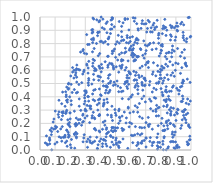
| Category | Series 0 |
|---|---|
| 0.2161539356165708 | 0.586 |
| 0.41989976840279575 | 0.482 |
| 0.9352542422735868 | 0.364 |
| 0.20114116399505655 | 0.039 |
| 100000.0 | 100000 |
| 0.8795964592983412 | 0.64 |
| 0.7748921591389206 | 0.094 |
| 0.61183253903875 | 0.728 |
| 0.23747542398676857 | 0.2 |
| 0.33232374744552895 | 0.097 |
| 0.9572385159710117 | 0.241 |
| 0.23008891402111764 | 0.014 |
| 0.7977676993184044 | 0.021 |
| 100000.0 | 100000 |
| 0.7029643959720894 | 0.747 |
| 0.8457570522916442 | 0.16 |
| 0.7361715812891809 | 0.919 |
| 0.3556559686619015 | 0.984 |
| 0.3066459170334216 | 0.294 |
| 100000.0 | 100000 |
| 0.6024444287754388 | 0.397 |
| 0.689767738971846 | 0.691 |
| 100000.0 | 100000 |
| 0.34143358584577 | 0.832 |
| 100000.0 | 100000 |
| 0.8909479142647417 | 0.263 |
| 100000.0 | 100000 |
| 0.47502444518757647 | 0.943 |
| 100000.0 | 100000 |
| 0.7279271009671584 | 0.515 |
| 0.5890369219224744 | 0.903 |
| 0.3450081896131896 | 0.879 |
| 0.2880844816290302 | 0.214 |
| 0.46309427932886416 | 0.449 |
| 0.9234885255635588 | 0.446 |
| 0.47305454525723445 | 0.247 |
| 100000.0 | 100000 |
| 0.3505128758518026 | 0.653 |
| 0.11003345545765641 | 0.172 |
| 0.4163282621625086 | 0.516 |
| 0.7704589240470142 | 0.256 |
| 0.6444966638122671 | 0.803 |
| 0.35416905204247706 | 0.828 |
| 0.7169626679551163 | 0.665 |
| 0.4362653041262585 | 0.045 |
| 100000.0 | 100000 |
| 0.42452631995949996 | 0.354 |
| 0.46271314737771807 | 0.567 |
| 0.38486134550629203 | 0.039 |
| 0.2276032860003152 | 0.292 |
| 0.8174627857066217 | 0.933 |
| 0.4864012044959657 | 0.619 |
| 0.43257249432898137 | 0.815 |
| 100000.0 | 100000 |
| 0.348404229247705 | 0.421 |
| 0.3627855262940509 | 0.235 |
| 100000.0 | 100000 |
| 0.3103982246565159 | 0.063 |
| 0.35065532570353375 | 0.992 |
| 0.18958295649528623 | 0.501 |
| 0.5605766558687318 | 0.73 |
| 0.10133968948468597 | 0.293 |
| 0.8358072865204941 | 0.476 |
| 0.5955719380326497 | 0.764 |
| 100000.0 | 100000 |
| 0.7722635357408648 | 0.925 |
| 0.8876915098608822 | 0.016 |
| 0.8430997614928754 | 0.338 |
| 0.8427255991765477 | 0.279 |
| 0.35171628626008145 | 0.681 |
| 0.81366804797898 | 0.408 |
| 0.35221129753561753 | 0.378 |
| 0.8137654567318902 | 0.066 |
| 100000.0 | 100000 |
| 0.4414782513297406 | 0.166 |
| 0.894685336148168 | 0.01 |
| 0.46665392885090373 | 0.876 |
| 100000.0 | 100000 |
| 0.6484714881347159 | 0.056 |
| 0.6692057437729021 | 0.914 |
| 0.3040026629180361 | 0.445 |
| 0.8268137096556616 | 0.922 |
| 0.5496234064686124 | 0.083 |
| 100000.0 | 100000 |
| 0.6063901558262088 | 0.751 |
| 0.7484689300069599 | 0.938 |
| 100000.0 | 100000 |
| 0.4435139204763989 | 0.383 |
| 100000.0 | 100000 |
| 0.24072936537829048 | 0.43 |
| 0.3870490325203445 | 0.377 |
| 0.8779951112925786 | 0.135 |
| 0.8368489890606061 | 0.38 |
| 0.4783579836724976 | 0.983 |
| 0.8437905290009425 | 0.184 |
| 0.18649975217800974 | 0.134 |
| 0.994532172213015 | 0.849 |
| 100000.0 | 100000 |
| 0.35957673419079683 | 0.243 |
| 0.5144705458466957 | 0.676 |
| 0.6780416202440906 | 0.972 |
| 0.7018595485948129 | 0.949 |
| 0.8172321611773572 | 0.521 |
| 0.7031949171853407 | 0.089 |
| 0.3182024782410191 | 0.578 |
| 0.4474183520769388 | 0.357 |
| 0.7808330578419791 | 0.057 |
| 0.26590883804134713 | 0.23 |
| 0.8140938097799996 | 0.043 |
| 0.8605464876303114 | 0.664 |
| 0.6498580296543925 | 0.479 |
| 100000.0 | 100000 |
| 0.1766870286308334 | 0.298 |
| 0.5380603899644512 | 0.614 |
| 0.13731205458175855 | 0.159 |
| 0.3503996814501682 | 0.059 |
| 0.5010368804573674 | 0.795 |
| 0.6932517274135809 | 0.534 |
| 0.9130346430179311 | 0.93 |
| 0.8033948839825745 | 0.538 |
| 0.4053760239787898 | 0.409 |
| 0.5008801040690651 | 0.697 |
| 100000.0 | 100000 |
| 0.08711778041327911 | 0.21 |
| 0.6156306264523934 | 0.699 |
| 100000.0 | 100000 |
| 0.5654656374248346 | 0.765 |
| 0.5868868811805875 | 0.804 |
| 0.7539279228868306 | 0.058 |
| 0.8774852047986018 | 0.472 |
| 0.4674477414999131 | 0.109 |
| 0.7780735391836444 | 0.006 |
| 0.6271073925445417 | 0.672 |
| 0.8250647143278582 | 0.542 |
| 100000.0 | 100000 |
| 100000.0 | 100000 |
| 0.8047507636045643 | 0.748 |
| 0.4874070258714641 | 0.039 |
| 0.29276145703731415 | 0.115 |
| 0.6993385012486587 | 0.641 |
| 0.7022049974101413 | 0.206 |
| 100000.0 | 100000 |
| 0.7815393335905971 | 0.316 |
| 100000.0 | 100000 |
| 0.5954620568127152 | 0.279 |
| 100000.0 | 100000 |
| 0.6248249345355702 | 0.968 |
| 100000.0 | 100000 |
| 0.48364797840621054 | 0.137 |
| 0.6973912460050656 | 0.789 |
| 0.4767062776365705 | 0.059 |
| 0.39414652992529253 | 0.26 |
| 0.8784271123001899 | 0.58 |
| 0.6214757202946098 | 0.669 |
| 100000.0 | 100000 |
| 100000.0 | 100000 |
| 0.413635456539839 | 0.026 |
| 0.7590100754607 | 0.905 |
| 0.5415464110174156 | 0.851 |
| 0.8400278599668184 | 0.901 |
| 0.6765204932556063 | 0.63 |
| 0.44535550541910607 | 0.476 |
| 0.28610729086547404 | 0.756 |
| 0.25987894420101154 | 0.384 |
| 0.5783360486779697 | 0.519 |
| 0.2271220263469843 | 0.121 |
| 0.9112236034397349 | 0.763 |
| 0.6492858052713943 | 0.911 |
| 0.12557262978547135 | 0.374 |
| 0.4835549519946887 | 0.093 |
| 0.33305550577464627 | 0.314 |
| 0.9571649707675781 | 0.691 |
| 0.4325619957917777 | 0.479 |
| 0.675145354288876 | 0.508 |
| 0.299233196999524 | 0.296 |
| 0.5051266582021852 | 0.625 |
| 0.4199936199297607 | 0.806 |
| 0.44696051405441684 | 0.129 |
| 0.5240828358347355 | 0.307 |
| 0.6990808962996781 | 0.522 |
| 100000.0 | 100000 |
| 100000.0 | 100000 |
| 0.5874812400544747 | 0.494 |
| 0.6317933143239283 | 0.176 |
| 0.2956110134236266 | 0.391 |
| 0.2923193159513082 | 0.6 |
| 0.7571890980332072 | 0.394 |
| 0.4166379338688877 | 0.984 |
| 100000.0 | 100000 |
| 0.4477449682096104 | 0.704 |
| 100000.0 | 100000 |
| 0.32232055922351177 | 0.367 |
| 0.9091163710487771 | 0.018 |
| 0.7108506981624562 | 0.783 |
| 0.23703389161985722 | 0.58 |
| 0.6888135037152123 | 0.538 |
| 100000.0 | 100000 |
| 0.12080180044392519 | 0.267 |
| 0.3357422234892846 | 0.33 |
| 0.27018320631858517 | 0.298 |
| 100000.0 | 100000 |
| 0.6404366334616473 | 0.033 |
| 0.2935645880855714 | 0.727 |
| 0.18974963144224288 | 0.464 |
| 0.8641580990747965 | 0.827 |
| 0.5512236396858423 | 0.826 |
| 0.8370405661654527 | 0.727 |
| 0.6156325773028273 | 0.108 |
| 0.5157860296623329 | 0.481 |
| 0.4405582451316289 | 0.121 |
| 0.7199908444301367 | 0.176 |
| 100000.0 | 100000 |
| 100000.0 | 100000 |
| 0.9893917306930223 | 0.076 |
| 0.8703921242918102 | 0.854 |
| 0.14911529833595194 | 0.257 |
| 0.7424640935420491 | 0.755 |
| 0.4041612710457705 | 0.083 |
| 0.5606307026728751 | 0.497 |
| 0.4130326518182461 | 0.616 |
| 0.044936852388212545 | 0.047 |
| 0.8339295491779962 | 0.363 |
| 0.8649326083031706 | 0.271 |
| 0.39690805388752204 | 0.614 |
| 0.3799069616132692 | 0.013 |
| 0.3157836041023616 | 0.793 |
| 100000.0 | 100000 |
| 100000.0 | 100000 |
| 0.6501492892115902 | 0.828 |
| 0.16030550000732224 | 0.097 |
| 0.7850547899392751 | 0.257 |
| 0.6236168348974531 | 0.524 |
| 100000.0 | 100000 |
| 0.8463578136750755 | 0.013 |
| 0.4222346371207769 | 0.348 |
| 0.45915310682362176 | 0.437 |
| 0.7277437696514759 | 0.065 |
| 0.5955658162719669 | 0.846 |
| 0.9671263497926211 | 0.266 |
| 0.519699922907073 | 0.03 |
| 0.6808887312694432 | 0.712 |
| 100000.0 | 100000 |
| 0.724327339117487 | 0.963 |
| 0.7971523251236095 | 0.565 |
| 0.8540554858579066 | 0.735 |
| 0.3212281639520901 | 0.487 |
| 0.3623238701722653 | 0.371 |
| 100000.0 | 100000 |
| 0.9418885664438478 | 0.507 |
| 0.19846484954860344 | 0.176 |
| 0.904050593890364 | 0.029 |
| 0.606769126997257 | 0.713 |
| 0.5287691661675266 | 0.632 |
| 100000.0 | 100000 |
| 0.17008842860875562 | 0.438 |
| 0.9699716753855563 | 0.814 |
| 0.13904248039666922 | 0.093 |
| 100000.0 | 100000 |
| 0.8976393136235393 | 0.061 |
| 0.6677989491663604 | 0.755 |
| 0.07806497772430676 | 0.001 |
| 100000.0 | 100000 |
| 0.8218451781444016 | 0.617 |
| 0.3227544406798609 | 0.525 |
| 0.9007321652645686 | 0.222 |
| 0.3459469266448305 | 0.258 |
| 0.4053074894052573 | 0.588 |
| 100000.0 | 100000 |
| 0.6013295515187901 | 0.4 |
| 100000.0 | 100000 |
| 100000.0 | 100000 |
| 0.5252592630170598 | 0.06 |
| 0.6612015851181061 | 0.17 |
| 0.6116479478042575 | 0.415 |
| 0.8302002787218757 | 0.441 |
| 0.9471396139826678 | 0.526 |
| 0.30986966253961046 | 0.646 |
| 0.6519075640238242 | 0.703 |
| 0.9514955520571087 | 0.941 |
| 0.9978722101556757 | 0.854 |
| 0.9645457253125571 | 0.654 |
| 0.348880957284859 | 0.63 |
| 0.9044428359692432 | 0.283 |
| 0.884211800169146 | 0.062 |
| 0.9855708750236848 | 0.344 |
| 0.35865154406628397 | 0.763 |
| 0.7679011204779839 | 0.305 |
| 0.8777369880975842 | 0.782 |
| 0.7433915475733103 | 0.887 |
| 0.06378914394543145 | 0.072 |
| 0.45403216484671327 | 0.135 |
| 0.17783484537935457 | 0.148 |
| 0.7724327430335248 | 0.336 |
| 0.8990202852409879 | 0.849 |
| 0.523019792163674 | 0.018 |
| 0.4246470611905723 | 0.076 |
| 0.5449580733607431 | 0.386 |
| 0.38369100442770665 | 0.882 |
| 0.45508617591180645 | 0.561 |
| 100000.0 | 100000 |
| 0.45022848305588414 | 0.637 |
| 0.7895901682202835 | 0.707 |
| 0.9094891405102665 | 0.037 |
| 100000.0 | 100000 |
| 0.5635129035813577 | 0.98 |
| 0.4071778194988114 | 0.817 |
| 0.883572493560269 | 0.314 |
| 100000.0 | 100000 |
| 0.29590412700034774 | 0.412 |
| 0.5109441080328259 | 0.814 |
| 100000.0 | 100000 |
| 0.8323609164249491 | 0.922 |
| 100000.0 | 100000 |
| 0.4935504369765089 | 0.759 |
| 0.46137129005663546 | 0.652 |
| 0.6123712583181691 | 0.852 |
| 0.43054717368240947 | 0.218 |
| 0.1812907303855258 | 0.36 |
| 0.9298582233336461 | 0.474 |
| 0.24402626569893582 | 0.639 |
| 0.8125526818961452 | 0.913 |
| 0.3812572289457742 | 0.86 |
| 0.42117592440608465 | 0.078 |
| 0.8718337546394386 | 0.73 |
| 0.6575793676242783 | 0.545 |
| 0.3193901949244844 | 0.506 |
| 0.17408255747036727 | 0.414 |
| 0.8675427273861873 | 0.319 |
| 0.563382843097646 | 0.988 |
| 100000.0 | 100000 |
| 0.06326542471394003 | 0.09 |
| 0.2535090642840061 | 0.228 |
| 0.5780035241687718 | 0.844 |
| 0.19447284984645252 | 0.206 |
| 0.6622635523361565 | 0.616 |
| 0.9653637561556796 | 0.227 |
| 0.7148115714099713 | 0.656 |
| 0.19100861022531712 | 0.188 |
| 0.43900096495097873 | 0.155 |
| 0.6938031754775056 | 0.54 |
| 0.748574669875447 | 0.293 |
| 0.5496320894907313 | 0.443 |
| 0.3486936007191421 | 0.807 |
| 0.9793223323568793 | 0.039 |
| 0.3232228025016989 | 0.667 |
| 0.2977391018253992 | 0.241 |
| 0.8375248754189472 | 0.216 |
| 100000.0 | 100000 |
| 0.3177397680627416 | 0.083 |
| 0.28962303392210387 | 0.588 |
| 100000.0 | 100000 |
| 0.44549946822202524 | 0.963 |
| 0.45106115881645703 | 0.429 |
| 0.6807857857260671 | 0.45 |
| 0.6338427732365622 | 0.485 |
| 0.8895567920514615 | 0.554 |
| 0.4236680211710556 | 0.376 |
| 0.034999285437185446 | 0.053 |
| 0.3933644899746831 | 0.459 |
| 0.8167983984908876 | 0.002 |
| 0.8989392749071643 | 0.654 |
| 0.07702373903624016 | 0.165 |
| 0.2821061848885069 | 0.209 |
| 0.22621218344685756 | 0.599 |
| 0.911185245064318 | 0.306 |
| 0.24512186773458444 | 0.122 |
| 0.35040115393110094 | 0.887 |
| 100000.0 | 100000 |
| 0.6449987093613583 | 0.32 |
| 0.20638637844330998 | 0.017 |
| 0.196439689819916 | 0.4 |
| 0.5755661192026909 | 0.543 |
| 0.24006997256800922 | 0.1 |
| 0.2423306048670898 | 0.611 |
| 100000.0 | 100000 |
| 0.39579143678330087 | 0.972 |
| 0.7768087571487554 | 0.032 |
| 0.8646386325876582 | 0.866 |
| 100000.0 | 100000 |
| 100000.0 | 100000 |
| 0.19911648494038858 | 0.28 |
| 0.07527996080133037 | 0.115 |
| 100000.0 | 100000 |
| 0.24156917855556015 | 0.091 |
| 0.8082628267117962 | 0.238 |
| 0.5951914799501979 | 0.581 |
| 0.5728054147474118 | 0.807 |
| 0.9682213604385459 | 0.352 |
| 0.8796499198286297 | 0.096 |
| 0.43804508904840456 | 0.951 |
| 0.8399076938220617 | 0.685 |
| 0.499460638724875 | 0.491 |
| 100000.0 | 100000 |
| 100000.0 | 100000 |
| 0.2585228314103668 | 0.201 |
| 0.42260580299232886 | 0.342 |
| 0.833767956408413 | 0.452 |
| 0.4919374073342221 | 0.146 |
| 0.8710056695357674 | 0.919 |
| 0.7288306473159012 | 0.802 |
| 0.34403791162159436 | 0.241 |
| 0.7868918120944124 | 0.877 |
| 0.8189353778838091 | 0.329 |
| 0.1475708515238121 | 0.176 |
| 0.43761506671012684 | 0.099 |
| 0.1530055972801605 | 0.288 |
| 0.6733544592396673 | 0.051 |
| 0.7761248935370187 | 0.975 |
| 0.697367004399133 | 0.724 |
| 0.2132100475703005 | 0.433 |
| 0.5388919880438472 | 0.821 |
| 0.7810206499689517 | 0.121 |
| 0.6539066694877919 | 0.006 |
| 100000.0 | 100000 |
| 0.5890006885744907 | 0.541 |
| 0.2429192267029051 | 0.547 |
| 0.1658287183140087 | 0.097 |
| 0.3609918598700832 | 0.597 |
| 0.501281767402513 | 0.167 |
| 100000.0 | 100000 |
| 100000.0 | 100000 |
| 0.6970889801025905 | 0.488 |
| 0.851452152701772 | 0.404 |
| 0.30342235799463657 | 0.428 |
| 0.2039665821174368 | 0.556 |
| 0.9814744795705573 | 0.042 |
| 0.9720636813065929 | 0.837 |
| 0.8354742875771314 | 0.001 |
| 0.6400468684009598 | 0.839 |
| 0.7876426157718219 | 0.513 |
| 0.47240009723965737 | 0.146 |
| 0.3620352690411436 | 0.066 |
| 0.8370653675229826 | 0.205 |
| 0.4480287499430319 | 0.264 |
| 0.6598224959353272 | 0.25 |
| 0.27525414617461563 | 0.186 |
| 100000.0 | 100000 |
| 0.17977359762434586 | 0.028 |
| 0.07707981595026747 | 0.139 |
| 0.9757272986450334 | 0.533 |
| 0.862327462220161 | 0.373 |
| 0.61692944995512 | 0.994 |
| 0.2273153105117215 | 0.454 |
| 100000.0 | 100000 |
| 0.480909660994258 | 0.992 |
| 0.6327472273925381 | 0.676 |
| 0.81065834960449 | 0.781 |
| 100000.0 | 100000 |
| 0.8512854030177606 | 0.223 |
| 0.5103859568208314 | 0.519 |
| 0.8420100028114222 | 0.565 |
| 0.3607909487217238 | 0.673 |
| 0.48864187170422557 | 0.169 |
| 100000.0 | 100000 |
| 0.7812131252688854 | 0.591 |
| 0.7437220844806409 | 0.436 |
| 100000.0 | 100000 |
| 0.7258303580881399 | 0.382 |
| 0.6747229420324705 | 0.95 |
| 0.8887626904322424 | 0.743 |
| 0.7429663988023365 | 0.034 |
| 0.6978506135492212 | 0.362 |
| 0.5814771238960005 | 0.012 |
| 0.54013287966447 | 0.89 |
| 0.9784595479397352 | 0.044 |
| 0.9939334223915954 | 0.078 |
| 100000.0 | 100000 |
| 100000.0 | 100000 |
| 0.6437634626512232 | 0.698 |
| 100000.0 | 100000 |
| 0.691923110367989 | 0.168 |
| 0.8745115393199352 | 0.064 |
| 0.577102125151582 | 0.86 |
| 0.22462123289700042 | 0.541 |
| 0.9781841875784675 | 0.276 |
| 0.8690507514947815 | 0.442 |
| 100000.0 | 100000 |
| 0.17686728137666163 | 0.15 |
| 0.486924029257065 | 0.743 |
| 0.8956344731553232 | 0.135 |
| 0.31222324413449076 | 0.256 |
| 0.7932466149432835 | 0.538 |
| 0.5061448433016141 | 0.052 |
| 0.1715013471344572 | 0.276 |
| 0.47864157170062016 | 0.725 |
| 0.8224651848237635 | 0.915 |
| 0.8094938840945678 | 0.794 |
| 0.2552427031145833 | 0.605 |
| 0.23674795634049917 | 0.18 |
| 0.14987583072362765 | 0.436 |
| 0.9493240019417231 | 0.86 |
| 0.5404417652534308 | 0.73 |
| 0.3902837494472453 | 0.964 |
| 0.6744733539520829 | 0.167 |
| 0.14366651853310453 | 0.348 |
| 0.8137781138873771 | 0.146 |
| 0.8674623121163298 | 0.562 |
| 0.2853265530548539 | 0.061 |
| 100000.0 | 100000 |
| 0.5699042390064201 | 0.203 |
| 0.4342275327441245 | 0.07 |
| 0.7846787043015442 | 0.84 |
| 0.37048847851419187 | 0.606 |
| 100000.0 | 100000 |
| 0.17724382046797882 | 0.067 |
| 100000.0 | 100000 |
| 100000.0 | 100000 |
| 0.37048128753796294 | 0.598 |
| 100000.0 | 100000 |
| 100000.0 | 100000 |
| 0.17322713902621778 | 0.401 |
| 0.7842956498553818 | 0.022 |
| 0.6745437734959007 | 0.555 |
| 0.20637282530927403 | 0.37 |
| 100000.0 | 100000 |
| 0.9077574063620687 | 0.901 |
| 0.6211499532394503 | 0.591 |
| 0.5801086368763595 | 0.462 |
| 0.2998684318961883 | 0.307 |
| 0.360045464145037 | 0.159 |
| 0.5305835134932086 | 0.058 |
| 0.4427709229615924 | 0.029 |
| 100000.0 | 100000 |
| 0.8943803318320779 | 0.825 |
| 0.48550369764228973 | 0.632 |
| 0.6415397051962547 | 0.704 |
| 0.8634380226678976 | 0.937 |
| 0.2850597344482104 | 0.269 |
| 0.06706393202554828 | 0.15 |
| 100000.0 | 100000 |
| 0.2062985918433078 | 0.494 |
| 0.5260596886439858 | 0.246 |
| 100000.0 | 100000 |
| 0.2575786130551333 | 0.493 |
| 0.0642676930549766 | 0.046 |
| 0.4567253393526831 | 0.849 |
| 0.32535986067840617 | 0.794 |
| 0.5254186737042437 | 0.718 |
| 0.9055212408357552 | 0.464 |
| 100000.0 | 100000 |
| 0.5584746862371954 | 0.285 |
| 0.16977863458769238 | 0.277 |
| 0.7713395809431829 | 0.502 |
| 0.1769108908059137 | 0.473 |
| 0.10182656669573076 | 0.178 |
| 0.5767596677975096 | 0.51 |
| 0.7787901116892648 | 0.635 |
| 0.5979603696720714 | 0.816 |
| 0.3910821798095393 | 0.144 |
| 0.8494432346426387 | 0.53 |
| 0.7306361284172296 | 0.093 |
| 0.6191979492867346 | 0.79 |
| 0.3945375755750612 | 0.066 |
| 100000.0 | 100000 |
| 0.12428248745914727 | 0.247 |
| 0.3092186212786776 | 0.867 |
| 0.7516267850196204 | 0.656 |
| 0.47629482315338667 | 0.329 |
| 0.465045453748236 | 0.504 |
| 100000.0 | 100000 |
| 100000.0 | 100000 |
| 0.5208675532660367 | 0.059 |
| 0.5208290240642418 | 0.201 |
| 0.3740152401435315 | 0.801 |
| 0.3440060276945064 | 0.051 |
| 0.4787283045106263 | 0.166 |
| 0.40023473286109235 | 0.548 |
| 0.6352443794900545 | 0.827 |
| 0.6041661103175165 | 0.78 |
| 0.3544680758150949 | 0.569 |
| 0.7659360032133233 | 0.389 |
| 0.8121342450651896 | 0.502 |
| 0.8753654840421887 | 0.928 |
| 100000.0 | 100000 |
| 0.9775486374504836 | 0.383 |
| 100000.0 | 100000 |
| 0.5048463042497411 | 0.089 |
| 0.9706698640332 | 0.631 |
| 0.6494361702296393 | 0.423 |
| 0.14173614512337018 | 0.229 |
| 0.5436658501754066 | 0.255 |
| 0.9672632541924258 | 0.206 |
| 0.32228948483420694 | 0.538 |
| 0.3279485971432018 | 0.33 |
| 0.9915768198003447 | 0.169 |
| 0.44491415152689195 | 0.304 |
| 0.7523181074895072 | 0.806 |
| 0.24030365249553398 | 0.24 |
| 100000.0 | 100000 |
| 0.8755745370086633 | 0.119 |
| 0.3119035704212514 | 0.335 |
| 100000.0 | 100000 |
| 0.06384537776620347 | 0.079 |
| 0.7920324779929047 | 0.056 |
| 0.5881529986748086 | 0.589 |
| 0.3689292280337314 | 0.15 |
| 0.4751111523955045 | 0.645 |
| 0.4534928119424403 | 0.5 |
| 0.31096959820044856 | 0.637 |
| 0.8618377477771036 | 0.198 |
| 0.2449721160727094 | 0.19 |
| 0.20002029939595534 | 0.234 |
| 0.7453556741974118 | 0.054 |
| 0.23686079925917136 | 0.133 |
| 0.9426134903766706 | 0.29 |
| 0.9612576542922874 | 0.648 |
| 100000.0 | 100000 |
| 0.8572897849552676 | 0.303 |
| 0.41847585594483105 | 0.209 |
| 0.43149613548540233 | 0.664 |
| 0.5550813228788026 | 0.827 |
| 0.47617879172836397 | 0.91 |
| 100000.0 | 100000 |
| 100000.0 | 100000 |
| 0.5494792863398003 | 0.675 |
| 0.4493530373607929 | 0.622 |
| 0.7022913409557965 | 0.023 |
| 0.09870495708971072 | 0.045 |
| 0.18395476294930913 | 0.227 |
| 0.7541856366942632 | 0.953 |
| 0.42630044822001123 | 0.909 |
| 0.24338535673770334 | 0.511 |
| 0.6054994101322387 | 0.11 |
| 0.5405647223515567 | 0.93 |
| 0.5404627147244522 | 0.624 |
| 0.6470628255993647 | 0.454 |
| 0.6778573860680143 | 0.487 |
| 0.18798761822608345 | 0.096 |
| 0.754232207533115 | 0.465 |
| 100000.0 | 100000 |
| 0.28436041415873725 | 0.746 |
| 100000.0 | 100000 |
| 0.8395062570280519 | 0.435 |
| 0.769753787715513 | 0.454 |
| 0.41902146290682696 | 0.33 |
| 0.37934100023457606 | 0.34 |
| 0.6143381687147321 | 0.728 |
| 0.15417840625646173 | 0.095 |
| 0.4856563996565939 | 0.486 |
| 0.8200378529905683 | 0.182 |
| 0.8838326270129051 | 0.189 |
| 0.40730209427083164 | 0.644 |
| 0.9555500771669891 | 0.826 |
| 0.5501810593599021 | 0.956 |
| 0.6413540676893247 | 0.832 |
| 0.38389751361939983 | 0.555 |
| 0.38092121949109725 | 0.009 |
| 0.37557809622871174 | 0.095 |
| 0.6299125946671931 | 0.992 |
| 0.584453463145128 | 0.315 |
| 0.7850162377797247 | 0.864 |
| 0.41390378905194225 | 0.156 |
| 0.6277742768449927 | 0.113 |
| 0.5060360703393701 | 0.043 |
| 0.9477473803957017 | 0.885 |
| 100000.0 | 100000 |
| 0.3761158383573717 | 0.979 |
| 0.786034440475626 | 0.803 |
| 0.7446610836746281 | 0.57 |
| 0.9317996234876603 | 0.163 |
| 0.653056576846466 | 0.562 |
| 0.5213457471350493 | 0.585 |
| 0.8102985055901597 | 0.875 |
| 0.962580428773327 | 0.303 |
| 0.47895552267023733 | 0.744 |
| 100000.0 | 100000 |
| 0.18536801773086187 | 0.195 |
| 100000.0 | 100000 |
| 0.5656340102474062 | 0.512 |
| 0.6683894732509744 | 0.053 |
| 0.8962406414778786 | 0.599 |
| 0.5395333043558724 | 0.439 |
| 0.3210056094431062 | 0.401 |
| 0.6904896530550215 | 0.072 |
| 0.7327140444476824 | 0.311 |
| 0.8679039636646535 | 0.289 |
| 0.8663912595649401 | 0.262 |
| 0.23227239621358564 | 0.193 |
| 0.9819883714000636 | 0.996 |
| 0.49595827082312305 | 0.304 |
| 0.36150889193242164 | 0.615 |
| 100000.0 | 100000 |
| 100000.0 | 100000 |
| 100000.0 | 100000 |
| 0.71712301997804 | 0.189 |
| 0.6770813280443939 | 0.067 |
| 0.47026614577441095 | 0.977 |
| 0.14518659332295514 | 0.283 |
| 0.39886939998237525 | 0.815 |
| 0.3426737836498501 | 0.903 |
| 0.8393926682622623 | 0.326 |
| 100000.0 | 100000 |
| 0.767226272709356 | 0.558 |
| 0.5406946723254582 | 0.68 |
| 0.7267207746018668 | 0.193 |
| 0.5248404715967404 | 0.966 |
| 0.5254253648717758 | 0.804 |
| 0.6469704725751497 | 0.284 |
| 0.828206792048241 | 0.15 |
| 0.2633123638759819 | 0.602 |
| 100000.0 | 100000 |
| 0.09253913125731139 | 0.233 |
| 0.9957872544240333 | 0.368 |
| 0.43967576140284614 | 0.483 |
| 0.5718868503758952 | 0.511 |
| 0.27662484688278055 | 0.506 |
| 0.8523209171546353 | 0.383 |
| 0.2085052787880387 | 0.079 |
| 0.6775864311180786 | 0.239 |
| 0.521907236985914 | 0.295 |
| 0.8458003494036043 | 0.629 |
| 0.7089834148434923 | 0.658 |
| 0.23889617456403955 | 0.599 |
| 100000.0 | 100000 |
| 0.6441662164489186 | 0.501 |
| 0.9829000375860748 | 0.048 |
| 0.6507136945936093 | 0.901 |
| 0.4801885420634424 | 0.222 |
| 0.34772039689222867 | 0.738 |
| 0.8221476592951615 | 0.375 |
| 0.21581009577709265 | 0.619 |
| 0.9137094429575304 | 0.45 |
| 0.42148085378345956 | 0.076 |
| 0.594262123157194 | 0.206 |
| 0.9943681776596239 | 0.508 |
| 0.9097196941103439 | 0.273 |
| 0.36288148556162025 | 0.161 |
| 0.8832842049872964 | 0.482 |
| 0.8642018915272062 | 0.201 |
| 0.45082487008685235 | 0.794 |
| 0.8515201139085727 | 0.733 |
| 0.6262538713567845 | 0.715 |
| 0.530911045711461 | 0.219 |
| 0.7243800649767799 | 0.488 |
| 100000.0 | 100000 |
| 0.33023132292944446 | 0.07 |
| 0.4522594290932499 | 0.54 |
| 0.11736275632684612 | 0.139 |
| 100000.0 | 100000 |
| 0.66324165203839 | 0.113 |
| 0.4330131639408774 | 0.429 |
| 0.16583473738501586 | 0.111 |
| 0.40093847325777776 | 0.416 |
| 0.5930319077555344 | 0.576 |
| 0.8017642729020216 | 0.462 |
| 0.6406855859204101 | 0.95 |
| 0.6132955144005047 | 0.751 |
| 0.7677033299748451 | 0.29 |
| 0.8903682096477339 | 0.918 |
| 0.6892098028580068 | 0.947 |
| 100000.0 | 100000 |
| 0.9571661051894861 | 0.303 |
| 0.6873750128893156 | 0.82 |
| 0.3167516150986408 | 0.402 |
| 0.9301068823278266 | 0.705 |
| 0.7955970570354943 | 0.586 |
| 0.44410751648324087 | 0.472 |
| 0.9475311412973252 | 0.384 |
| 0.45190602981004957 | 0.836 |
| 0.939388919971099 | 0.96 |
| 0.6398827063103938 | 0.525 |
| 100000.0 | 100000 |
| 0.5904347306086828 | 0.174 |
| 0.5013508962225716 | 0.144 |
| 100000.0 | 100000 |
| 0.7608114463451493 | 0.919 |
| 0.2832980159011502 | 0.571 |
| 0.46654438742418625 | 0.908 |
| 0.7015792115556282 | 0.091 |
| 0.939334685177777 | 0.619 |
| 0.29568068364380495 | 0.444 |
| 0.5542714831101204 | 0.153 |
| 0.6876868421320499 | 0.405 |
| 100000.0 | 100000 |
| 0.7886284540753999 | 0.321 |
| 0.51378658609896 | 0.167 |
| 0.46621649693470146 | 0.02 |
| 0.8721456556508352 | 0.7 |
| 0.5214508960322984 | 0.438 |
| 0.8352710762287054 | 0.372 |
| 100000.0 | 100000 |
| 0.5835271636016826 | 0.67 |
| 0.6242263066393349 | 0.716 |
| 0.7169223936512344 | 0.245 |
| 0.6765011788292707 | 0.495 |
| 0.1662143849835629 | 0.329 |
| 100000.0 | 100000 |
| 100000.0 | 100000 |
| 0.31899322885486914 | 0.616 |
| 0.38601353275556227 | 0.709 |
| 0.050150111840483125 | 0.038 |
| 0.15186507535001392 | 0.278 |
| 0.3562974954783308 | 0.528 |
| 0.9566248676380843 | 0.755 |
| 0.4918005164129222 | 0.926 |
| 100000.0 | 100000 |
| 0.8227844225848643 | 0.1 |
| 0.18801442343724406 | 0.496 |
| 0.4991858141285399 | 0.278 |
| 0.6070802643806749 | 0.198 |
| 0.9110566518488161 | 0.895 |
| 0.39608011547452404 | 0.384 |
| 100000.0 | 100000 |
| 0.5750374005196371 | 0.477 |
| 0.9403491777848496 | 0.734 |
| 0.2927022434477736 | 0.346 |
| 0.7180162872984243 | 0.62 |
| 0.9508060690049497 | 0.26 |
| 0.9922451506051916 | 0.104 |
| 0.7980947372060285 | 0.727 |
| 0.2596532093465902 | 0.329 |
| 100000.0 | 100000 |
| 100000.0 | 100000 |
| 0.3088550924461442 | 0.723 |
| 0.9067026419432186 | 0.955 |
| 0.4433317871775847 | 0.882 |
| 0.18840111685339034 | 0.117 |
| 0.5472713567029844 | 0.146 |
| 100000.0 | 100000 |
| 0.9198108677691555 | 0.421 |
| 0.8068649188047584 | 0.6 |
| 0.5630294748888055 | 0.601 |
| 100000.0 | 100000 |
| 0.39534368283653654 | 0.725 |
| 0.9143046460284752 | 0.302 |
| 100000.0 | 100000 |
| 0.7827496277097576 | 0.183 |
| 0.19862747244861667 | 0.278 |
| 0.9209661091850612 | 0.021 |
| 0.8301083166260349 | 0.703 |
| 0.4767144597438644 | 0.994 |
| 0.8088428796807996 | 0.433 |
| 0.19337775211317276 | 0.106 |
| 0.2073843966122737 | 0.341 |
| 0.8647385877252662 | 0.062 |
| 0.5776485974528265 | 0.561 |
| 0.31473348108000365 | 0.02 |
| 0.41257222544688466 | 0.919 |
| 0.3371857118536291 | 0.309 |
| 100000.0 | 100000 |
| 100000.0 | 100000 |
| 100000.0 | 100000 |
| 0.769842381830744 | 0.76 |
| 0.38283795726227265 | 0.885 |
| 0.6187601710138138 | 0.287 |
| 0.4679130266141003 | 0.517 |
| 0.8501966211298104 | 0.024 |
| 0.8064186274987799 | 0.63 |
| 0.5035009945265774 | 0.26 |
| 0.39068363666351924 | 0.631 |
| 0.3554839416779244 | 0.449 |
| 0.7980482394780269 | 0.607 |
| 0.1024729001854211 | 0.162 |
| 0.9303642568155629 | 0.576 |
| 0.9147394670996717 | 0.648 |
| 0.48760598430034674 | 0.609 |
| 0.45188543210170506 | 0.705 |
| 0.38967585077127187 | 0.554 |
| 0.9670140278159862 | 0.637 |
| 0.5987210477877777 | 0.571 |
| 100000.0 | 100000 |
| 100000.0 | 100000 |
| 0.9843036800196007 | 0.189 |
| 0.47683239724733495 | 0.17 |
| 0.8225733737141598 | 0.146 |
| 0.39310702314435186 | 0.626 |
| 0.17488590003070958 | 0.287 |
| 0.650234394248985 | 0.045 |
| 0.4686701349440049 | 0.102 |
| 100000.0 | 100000 |
| 0.5282558743833922 | 0.243 |
| 0.5845334935202232 | 0.322 |
| 100000.0 | 100000 |
| 0.5807083325820445 | 0.985 |
| 0.9456368683079951 | 0.501 |
| 0.9838869820204684 | 0.18 |
| 0.38318302137583893 | 0.3 |
| 0.9420804833332697 | 0.227 |
| 0.042702606271944554 | 0.106 |
| 0.4381753020271788 | 0.449 |
| 100000.0 | 100000 |
| 0.2897802178765282 | 0.09 |
| 0.12674099828046537 | 0.099 |
| 0.706896447937775 | 0.887 |
| 0.9378201988055306 | 0.185 |
| 0.47235922819349063 | 0.261 |
| 0.5911260377409562 | 0.751 |
| 0.8345227102171859 | 0.862 |
| 0.5018279530732392 | 0.074 |
| 0.5722081953973207 | 0.241 |
| 0.3531165302506014 | 0.283 |
| 0.6282801308333547 | 0.528 |
| 0.11265593711147048 | 0.059 |
| 100000.0 | 100000 |
| 0.5332231269027894 | 0.469 |
| 0.36559903955035156 | 0.454 |
| 0.42952793674959033 | 0.187 |
| 0.3957243453275199 | 0.136 |
| 0.3537031607354092 | 0.84 |
| 100000.0 | 100000 |
| 0.5692164304986155 | 0.738 |
| 0.8766259234106685 | 0.753 |
| 0.1755629646218282 | 0.372 |
| 0.4142799744396982 | 0.047 |
| 0.8266085691809608 | 0.982 |
| 0.7319256044233263 | 0.888 |
| 0.24856922366870648 | 0.434 |
| 0.1816022404394092 | 0.377 |
| 100000.0 | 100000 |
| 100000.0 | 100000 |
| 0.38873053190074613 | 0.524 |
| 100000.0 | 100000 |
| 0.5427217139754359 | 0.162 |
| 0.7491005081237627 | 0.587 |
| 100000.0 | 100000 |
| 0.6183307557546172 | 0.763 |
| 0.7117891063727398 | 0.914 |
| 0.8162834440513513 | 0.618 |
| 0.2288531974415059 | 0.116 |
| 0.2836501960692276 | 0.261 |
| 0.7160745975927771 | 0.974 |
| 0.9884309784605608 | 0.997 |
| 100000.0 | 100000 |
| 0.544610350188826 | 0.639 |
| 0.9437529525828321 | 0.406 |
| 100000.0 | 100000 |
| 0.3939369624056994 | 0.267 |
| 0.9507354723463413 | 0.518 |
| 0.8015530155585247 | 0.787 |
| 0.743958309003902 | 0.157 |
| 0.8211420466317834 | 0.091 |
| 0.51852400888631 | 0.862 |
| 0.9423884575026449 | 0.365 |
| 0.2687066704201867 | 0.736 |
| 0.49084667397360404 | 0.51 |
| 0.6465764511724684 | 0.121 |
| 0.6745812878851986 | 0.122 |
| 0.09079528610870513 | 0.157 |
| 0.5708918240952838 | 0.62 |
| 0.3926830201942094 | 0.887 |
| 0.5394397711743586 | 0.669 |
| 100000.0 | 100000 |
| 100000.0 | 100000 |
| 100000.0 | 100000 |
| 0.9481707111277052 | 0.844 |
| 0.6371957707252935 | 0.583 |
| 100000.0 | 100000 |
| 100000.0 | 100000 |
| 100000.0 | 100000 |
| 100000.0 | 100000 |
| 0.47601371202645437 | 0.649 |
| 0.7837883730251486 | 0.501 |
| 0.6916702691373745 | 0.483 |
| 100000.0 | 100000 |
| 0.9744364485794659 | 0.061 |
| 0.6747886484887012 | 0.386 |
| 100000.0 | 100000 |
| 0.2981967272214471 | 0.366 |
| 100000.0 | 100000 |
| 0.18680358544003695 | 0.457 |
| 0.8569234482995839 | 0.441 |
| 0.3288734319575639 | 0.206 |
| 0.39018000100629013 | 0.259 |
| 100000.0 | 100000 |
| 0.8241952952326083 | 0.149 |
| 0.6320382750503398 | 0.561 |
| 0.8037094393323553 | 0.2 |
| 0.9316988587790327 | 0.948 |
| 0.1441422105001806 | 0.066 |
| 0.7354317306072483 | 0.367 |
| 0.3435588809427673 | 0.496 |
| 0.39107989483807193 | 0.259 |
| 0.4050712984175434 | 0.999 |
| 0.12566931425366634 | 0.287 |
| 0.6144967775578613 | 0.055 |
| 0.630507025765446 | 0.332 |
| 100000.0 | 100000 |
| 0.939450216096114 | 0.479 |
| 0.6581364118886817 | 0.35 |
| 0.8020575465146231 | 0.75 |
| 0.39119923470539875 | 0.352 |
| 0.4533023727252431 | 0.838 |
| 0.3488392327682578 | 0.906 |
| 0.1681664208152488 | 0.055 |
| 0.7216176873735116 | 0.792 |
| 0.6284284367048881 | 0.809 |
| 0.6292355845310281 | 0.472 |
| 0.5869000173864591 | 0.383 |
| 0.3070678617132503 | 0.435 |
| 0.6283284875911166 | 0.678 |
| 0.6650124717407723 | 0.762 |
| 0.2349798628404779 | 0.563 |
| 0.8326712966596892 | 0.645 |
| 0.8895985589210224 | 0.113 |
| 0.9009954995132696 | 0.931 |
| 0.950753270496091 | 0.287 |
| 0.8917617941569436 | 0.178 |
| 0.3325505351315765 | 0.057 |
| 0.8130107021750015 | 0.415 |
| 100000.0 | 100000 |